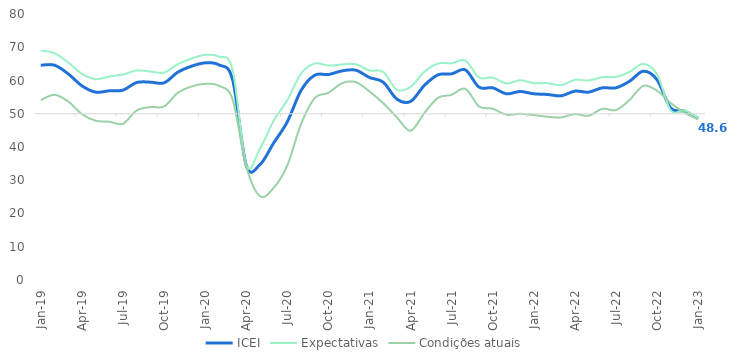
| Category | ICEI | Expectativas | Condições atuais |
|---|---|---|---|
| 2019-01-01 | 64.6 | 69 | 54.1 |
| 2019-02-01 | 64.6 | 68.2 | 55.7 |
| 2019-03-01 | 62 | 65.4 | 53.7 |
| 2019-04-01 | 58.4 | 62 | 49.9 |
| 2019-05-01 | 56.5 | 60.4 | 47.9 |
| 2019-06-01 | 56.9 | 61.2 | 47.6 |
| 2019-07-01 | 57.1 | 61.8 | 47 |
| 2019-08-01 | 59.4 | 63 | 51 |
| 2019-09-01 | 59.5 | 62.7 | 52 |
| 2019-10-01 | 59.3 | 62.4 | 52.2 |
| 2019-11-01 | 62.5 | 64.9 | 56.3 |
| 2019-12-01 | 64.3 | 66.6 | 58.2 |
| 2020-01-01 | 65.3 | 67.7 | 59 |
| 2020-02-01 | 64.7 | 67.2 | 58.4 |
| 2020-03-01 | 60.3 | 63.3 | 54.3 |
| 2020-04-01 | 34.5 | 34.7 | 34.1 |
| 2020-05-01 | 34.7 | 39.5 | 25.2 |
| 2020-06-01 | 41.2 | 47.9 | 27.7 |
| 2020-07-01 | 47.6 | 54.1 | 34.5 |
| 2020-08-01 | 57 | 62.1 | 46.9 |
| 2020-09-01 | 61.6 | 65.1 | 54.7 |
| 2020-10-01 | 61.8 | 64.5 | 56.3 |
| 2020-11-01 | 62.9 | 64.8 | 59.2 |
| 2020-12-01 | 63.1 | 64.9 | 59.5 |
| 2021-01-01 | 60.9 | 63 | 56.7 |
| 2021-02-01 | 59.5 | 62.6 | 53.2 |
| 2021-03-01 | 54.4 | 57.2 | 48.9 |
| 2021-04-01 | 53.7 | 58.1 | 44.9 |
| 2021-05-01 | 58.5 | 62.6 | 50.2 |
| 2021-06-01 | 61.7 | 65.1 | 54.8 |
| 2021-07-01 | 62 | 65.2 | 55.7 |
| 2021-08-01 | 63.2 | 66 | 57.5 |
| 2021-09-01 | 58 | 60.9 | 52.2 |
| 2021-10-01 | 57.8 | 60.9 | 51.5 |
| 2021-11-01 | 56 | 59.1 | 49.7 |
| 2021-12-01 | 56.7 | 60.1 | 50 |
| 2022-01-01 | 56 | 59.2 | 49.6 |
| 2022-02-01 | 55.8 | 59.2 | 49.1 |
| 2022-03-01 | 55.4 | 58.6 | 48.9 |
| 2022-04-01 | 56.8 | 60.2 | 49.9 |
| 2022-05-01 | 56.5 | 60 | 49.4 |
| 2022-06-01 | 57.8 | 61 | 51.5 |
| 2022-07-01 | 57.8 | 61.1 | 51.1 |
| 2022-08-01 | 59.8 | 62.6 | 54.2 |
| 2022-09-01 | 62.8 | 65 | 58.4 |
| 2022-10-01 | 60.2 | 61.8 | 56.9 |
| 2022-11-01 | 51.7 | 51 | 53.2 |
| 2022-12-01 | 50.8 | 51 | 50.3 |
| 2023-01-01 | 48.6 | 48.8 | 48.3 |